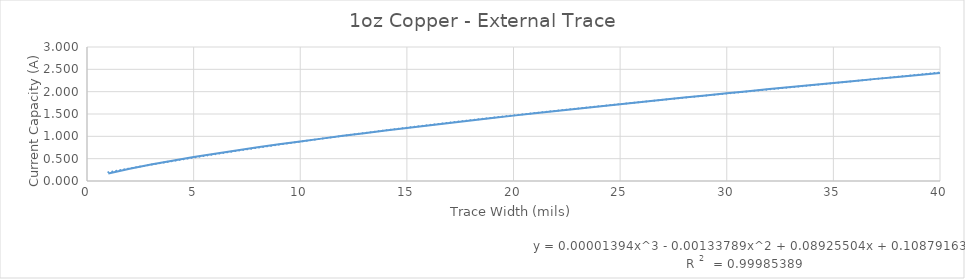
| Category | Series 0 |
|---|---|
| 0 | 0.167 |
| 1 | 0.276 |
| 2 | 0.37 |
| 3 | 0.456 |
| 4 | 0.536 |
| 5 | 0.611 |
| 6 | 0.684 |
| 7 | 0.753 |
| 8 | 0.82 |
| 9 | 0.886 |
| 10 | 0.949 |
| 11 | 1.011 |
| 12 | 1.071 |
| 13 | 1.13 |
| 14 | 1.188 |
| 15 | 1.245 |
| 16 | 1.301 |
| 17 | 1.356 |
| 18 | 1.41 |
| 19 | 1.464 |
| 20 | 1.516 |
| 21 | 1.568 |
| 22 | 1.62 |
| 23 | 1.671 |
| 24 | 1.721 |
| 25 | 1.77 |
| 26 | 1.819 |
| 27 | 1.868 |
| 28 | 1.916 |
| 29 | 1.964 |
| 30 | 2.011 |
| 31 | 2.058 |
| 32 | 2.104 |
| 33 | 2.15 |
| 34 | 2.196 |
| 35 | 2.241 |
| 36 | 2.286 |
| 37 | 2.331 |
| 38 | 2.375 |
| 39 | 2.419 |